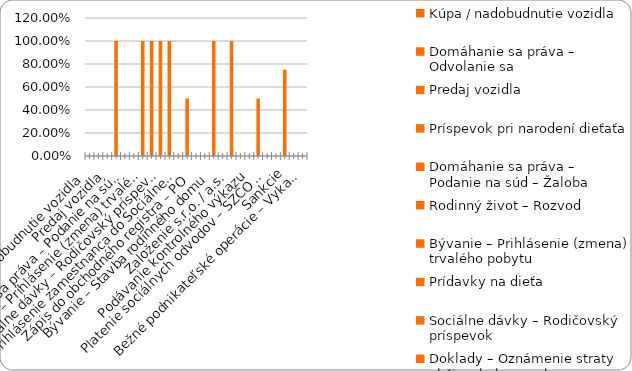
| Category | % |
|---|---|
| Kúpa / nadobudnutie vozidla | 0 |
| Domáhanie sa práva – Odvolanie sa | 0 |
| Predaj vozidla | 0 |
| Príspevok pri narodení dieťaťa | 1 |
| Domáhanie sa práva – Podanie na súd – Žaloba | 0 |
| Rodinný život – Rozvod | 0 |
| Bývanie – Prihlásenie (zmena) trvalého pobytu | 1 |
| Prídavky na dieťa | 1 |
| Sociálne dávky – Rodičovský príspevok | 1 |
| Doklady – Oznámenie straty občianskeho preukazu | 1 |
| Prihlásenie zamestnanca do Sociálnej poisťovne | 0 |
| Plnenie si daňových povinností – zamestnanec (FO) | 0.5 |
| Zápis do obchodného registra – PO | 0 |
| Živnosť - ukončenie | 0 |
| Bývanie – Stavba rodinného domu | 1 |
| Sociálne dávky – Príspevok v nezamestnanosti | 0 |
| Založenie s.r.o. / a.s. | 1 |
| Živnosť – založenie | 0 |
| Podávanie kontrolného výkazu | 0 |
| Plnenie si daňových povinností – SZČO / PO  | 0.5 |
| Platenie sociálnych odvodov – SZČO / PO | 0 |
| Živnosť - prerušenie | 0 |
| Sankcie | 0.75 |
| Živnosť - zmena | 0 |
| Bežné podnikateľské operácie – Vykazovanie štatistík | 0 |